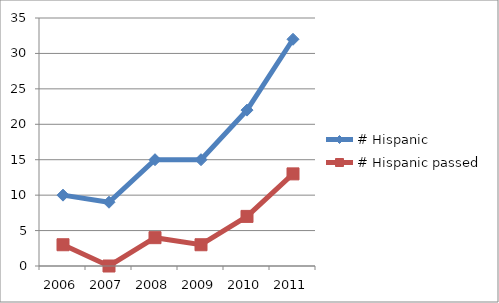
| Category | # Hispanic | # Hispanic passed |
|---|---|---|
| 2006.0 | 10 | 3 |
| 2007.0 | 9 | 0 |
| 2008.0 | 15 | 4 |
| 2009.0 | 15 | 3 |
| 2010.0 | 22 | 7 |
| 2011.0 | 32 | 13 |